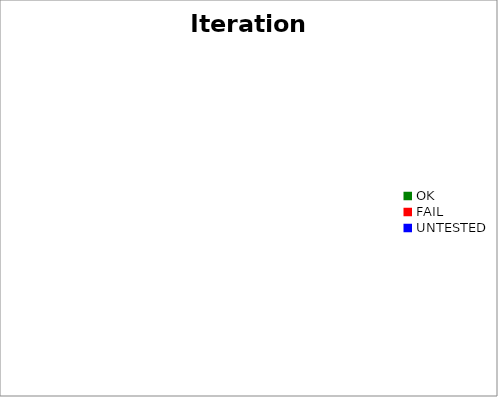
| Category | Iteration2 |
|---|---|
| OK | 0 |
| FAIL | 0 |
| UNTESTED | 0 |